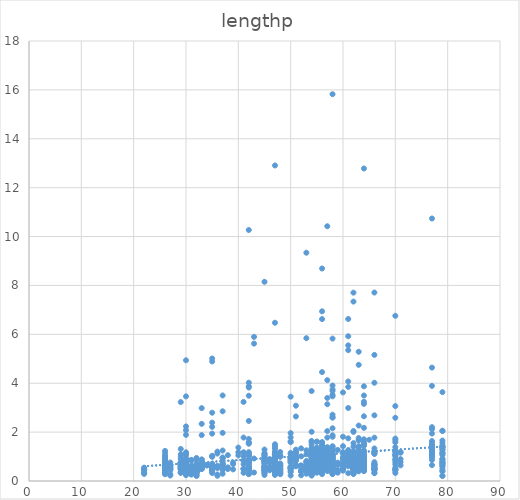
| Category | lengthp |
|---|---|
| 60.0 | 1.183 |
| 61.0 | 1.024 |
| 60.0 | 0.48 |
| 60.0 | 1.812 |
| 60.0 | 1.425 |
| 60.0 | 0.637 |
| 60.0 | 0.803 |
| 60.0 | 0.473 |
| 61.0 | 1.032 |
| 71.0 | 0.774 |
| 71.0 | 0.639 |
| 71.0 | 0.897 |
| 71.0 | 1.156 |
| 61.0 | 1.138 |
| 45.0 | 0.813 |
| 45.0 | 0.565 |
| 45.0 | 0.532 |
| 45.0 | 0.568 |
| 45.0 | 0.455 |
| 45.0 | 0.552 |
| 45.0 | 0.448 |
| 45.0 | 1.057 |
| 45.0 | 0.453 |
| 45.0 | 0.95 |
| 45.0 | 0.381 |
| 45.0 | 0.326 |
| 45.0 | 0.245 |
| 45.0 | 0.481 |
| 45.0 | 0.523 |
| 45.0 | 0.577 |
| 45.0 | 0.403 |
| 61.0 | 0.908 |
| 47.0 | 0.665 |
| 47.0 | 0.381 |
| 47.0 | 0.542 |
| 47.0 | 0.584 |
| 47.0 | 0.626 |
| 47.0 | 0.332 |
| 47.0 | 0.339 |
| 47.0 | 0.497 |
| 47.0 | 0.948 |
| 47.0 | 0.503 |
| 47.0 | 0.261 |
| 47.0 | 0.733 |
| 47.0 | 0.409 |
| 47.0 | 1.32 |
| 47.0 | 0.862 |
| 47.0 | 0.526 |
| 47.0 | 0.636 |
| 47.0 | 0.547 |
| 47.0 | 0.914 |
| 47.0 | 0.251 |
| 47.0 | 0.433 |
| 61.0 | 0.771 |
| 62.0 | 0.573 |
| 62.0 | 0.729 |
| 62.0 | 0.287 |
| 62.0 | 0.538 |
| 62.0 | 0.474 |
| 62.0 | 0.344 |
| 62.0 | 0.733 |
| 62.0 | 0.514 |
| 62.0 | 0.53 |
| 62.0 | 0.579 |
| 62.0 | 0.538 |
| 62.0 | 0.632 |
| 62.0 | 0.514 |
| 62.0 | 0.468 |
| 62.0 | 0.642 |
| 62.0 | 0.478 |
| 62.0 | 0.32 |
| 62.0 | 0.417 |
| 62.0 | 0.81 |
| 62.0 | 0.395 |
| 62.0 | 0.391 |
| 62.0 | 0.302 |
| 62.0 | 2.008 |
| 52.0 | 1.008 |
| 56.0 | 0.534 |
| 56.0 | 0.53 |
| 56.0 | 0.368 |
| 56.0 | 0.449 |
| 56.0 | 0.502 |
| 56.0 | 0.581 |
| 56.0 | 0.411 |
| 56.0 | 0.8 |
| 56.0 | 0.395 |
| 56.0 | 1.432 |
| 56.0 | 1.59 |
| 77.0 | 0.863 |
| 56.0 | 0.442 |
| 56.0 | 0.345 |
| 56.0 | 0.455 |
| 56.0 | 0.619 |
| 56.0 | 0.819 |
| 56.0 | 0.355 |
| 56.0 | 0.532 |
| 56.0 | 0.665 |
| 56.0 | 0.497 |
| 56.0 | 0.632 |
| 56.0 | 0.579 |
| 56.0 | 0.71 |
| 56.0 | 0.444 |
| 56.0 | 0.374 |
| 56.0 | 0.677 |
| 56.0 | 0.464 |
| 56.0 | 0.382 |
| 56.0 | 0.374 |
| 56.0 | 0.481 |
| 56.0 | 0.671 |
| 56.0 | 0.352 |
| 56.0 | 0.416 |
| 56.0 | 0.81 |
| 56.0 | 0.584 |
| 56.0 | 1.074 |
| 56.0 | 0.642 |
| 56.0 | 0.513 |
| 56.0 | 0.465 |
| 56.0 | 0.429 |
| 56.0 | 0.484 |
| 56.0 | 0.558 |
| 56.0 | 0.384 |
| 56.0 | 0.413 |
| 56.0 | 0.329 |
| 56.0 | 0.339 |
| 56.0 | 0.426 |
| 56.0 | 0.323 |
| 56.0 | 0.945 |
| 56.0 | 1.287 |
| 56.0 | 0.918 |
| 77.0 | 1.392 |
| 45.0 | 0.623 |
| 45.0 | 0.872 |
| 77.0 | 1.013 |
| 48.0 | 0.474 |
| 48.0 | 0.324 |
| 48.0 | 0.472 |
| 48.0 | 0.374 |
| 48.0 | 0.319 |
| 48.0 | 0.638 |
| 48.0 | 0.54 |
| 48.0 | 0.637 |
| 48.0 | 0.281 |
| 48.0 | 0.414 |
| 64.0 | 0.405 |
| 64.0 | 0.513 |
| 77.0 | 1.216 |
| 64.0 | 3.243 |
| 64.0 | 0.959 |
| 64.0 | 0.5 |
| 64.0 | 0.821 |
| 64.0 | 0.744 |
| 64.0 | 0.451 |
| 64.0 | 1.579 |
| 64.0 | 0.462 |
| 64.0 | 0.665 |
| 64.0 | 0.806 |
| 64.0 | 0.552 |
| 64.0 | 0.503 |
| 64.0 | 0.519 |
| 64.0 | 0.819 |
| 64.0 | 0.677 |
| 64.0 | 0.668 |
| 64.0 | 0.455 |
| 64.0 | 0.742 |
| 64.0 | 0.819 |
| 64.0 | 0.926 |
| 64.0 | 0.455 |
| 64.0 | 0.667 |
| 64.0 | 0.585 |
| 64.0 | 0.695 |
| 64.0 | 0.738 |
| 64.0 | 0.508 |
| 64.0 | 0.741 |
| 64.0 | 0.603 |
| 64.0 | 0.569 |
| 64.0 | 0.418 |
| 64.0 | 1.024 |
| 64.0 | 1.251 |
| 64.0 | 1.029 |
| 64.0 | 1.449 |
| 64.0 | 3.498 |
| 64.0 | 2.174 |
| 64.0 | 3.154 |
| 64.0 | 3.874 |
| 70.0 | 1.093 |
| 77.0 | 1.571 |
| 70.0 | 1.384 |
| 70.0 | 1.219 |
| 70.0 | 0.439 |
| 70.0 | 0.775 |
| 70.0 | 0.879 |
| 70.0 | 1.065 |
| 70.0 | 1.583 |
| 70.0 | 0.679 |
| 70.0 | 0.473 |
| 70.0 | 0.494 |
| 70.0 | 0.538 |
| 70.0 | 1.008 |
| 70.0 | 1.737 |
| 70.0 | 1.063 |
| 70.0 | 1.19 |
| 70.0 | 6.758 |
| 70.0 | 3.065 |
| 70.0 | 2.587 |
| 70.0 | 1.672 |
| 70.0 | 0.439 |
| 70.0 | 0.328 |
| 70.0 | 0.876 |
| 77.0 | 1.142 |
| 65.0 | 1.687 |
| 77.0 | 1.275 |
| 66.0 | 1.111 |
| 77.0 | 1.089 |
| 58.0 | 0.281 |
| 58.0 | 1.81 |
| 58.0 | 0.739 |
| 58.0 | 0.623 |
| 58.0 | 0.535 |
| 58.0 | 0.687 |
| 58.0 | 0.539 |
| 58.0 | 0.687 |
| 58.0 | 0.655 |
| 58.0 | 0.929 |
| 58.0 | 0.703 |
| 58.0 | 0.629 |
| 58.0 | 0.755 |
| 58.0 | 0.352 |
| 58.0 | 0.871 |
| 58.0 | 0.735 |
| 58.0 | 0.516 |
| 58.0 | 0.383 |
| 58.0 | 0.455 |
| 58.0 | 0.575 |
| 58.0 | 0.516 |
| 58.0 | 0.713 |
| 58.0 | 0.642 |
| 58.0 | 0.755 |
| 58.0 | 1.079 |
| 55.0 | 0.59 |
| 77.0 | 2.203 |
| 55.0 | 0.771 |
| 55.0 | 0.478 |
| 55.0 | 0.761 |
| 55.0 | 0.383 |
| 55.0 | 0.911 |
| 55.0 | 0.793 |
| 55.0 | 0.723 |
| 55.0 | 0.735 |
| 77.0 | 2.124 |
| 54.0 | 0.482 |
| 54.0 | 0.498 |
| 54.0 | 0.611 |
| 54.0 | 0.393 |
| 54.0 | 0.538 |
| 77.0 | 1.941 |
| 54.0 | 0.522 |
| 54.0 | 0.349 |
| 54.0 | 0.34 |
| 54.0 | 0.591 |
| 54.0 | 0.642 |
| 54.0 | 0.481 |
| 54.0 | 0.464 |
| 54.0 | 0.34 |
| 54.0 | 0.37 |
| 54.0 | 0.445 |
| 54.0 | 0.403 |
| 54.0 | 0.546 |
| 54.0 | 0.79 |
| 54.0 | 0.36 |
| 54.0 | 1.069 |
| 54.0 | 1.294 |
| 54.0 | 0.528 |
| 54.0 | 0.53 |
| 54.0 | 0.5 |
| 54.0 | 0.436 |
| 54.0 | 0.285 |
| 54.0 | 0.308 |
| 54.0 | 0.276 |
| 54.0 | 0.433 |
| 54.0 | 0.322 |
| 54.0 | 0.388 |
| 54.0 | 0.525 |
| 54.0 | 0.222 |
| 54.0 | 0.801 |
| 54.0 | 0.272 |
| 54.0 | 0.442 |
| 54.0 | 0.386 |
| 54.0 | 0.527 |
| 54.0 | 0.415 |
| 54.0 | 0.536 |
| 54.0 | 0.468 |
| 54.0 | 0.462 |
| 54.0 | 0.391 |
| 54.0 | 0.719 |
| 54.0 | 0.372 |
| 54.0 | 0.451 |
| 54.0 | 0.429 |
| 66.0 | 1.184 |
| 66.0 | 1.165 |
| 66.0 | 1.116 |
| 66.0 | 1.773 |
| 66.0 | 0.538 |
| 66.0 | 1.217 |
| 66.0 | 0.666 |
| 66.0 | 0.611 |
| 66.0 | 0.32 |
| 66.0 | 0.771 |
| 66.0 | 0.528 |
| 66.0 | 0.468 |
| 66.0 | 0.534 |
| 66.0 | 0.503 |
| 66.0 | 0.432 |
| 66.0 | 0.7 |
| 66.0 | 0.674 |
| 66.0 | 1.332 |
| 66.0 | 0.639 |
| 66.0 | 0.329 |
| 66.0 | 0.445 |
| 66.0 | 0.568 |
| 66.0 | 0.5 |
| 66.0 | 0.694 |
| 66.0 | 2.686 |
| 66.0 | 4.019 |
| 66.0 | 5.158 |
| 66.0 | 7.71 |
| 50.0 | 0.368 |
| 50.0 | 0.562 |
| 50.0 | 0.227 |
| 79.0 | 2.045 |
| 79.0 | 1.41 |
| 79.0 | 1.381 |
| 79.0 | 0.39 |
| 79.0 | 0.503 |
| 79.0 | 0.413 |
| 79.0 | 0.906 |
| 79.0 | 1.655 |
| 79.0 | 0.613 |
| 79.0 | 1.284 |
| 79.0 | 1.119 |
| 79.0 | 1.377 |
| 79.0 | 1.453 |
| 79.0 | 0.7 |
| 79.0 | 0.717 |
| 79.0 | 0.777 |
| 79.0 | 0.773 |
| 79.0 | 0.684 |
| 79.0 | 1.559 |
| 79.0 | 1.148 |
| 79.0 | 1.168 |
| 79.0 | 1.397 |
| 79.0 | 1.287 |
| 79.0 | 1.065 |
| 79.0 | 2.058 |
| 79.0 | 0.606 |
| 79.0 | 0.832 |
| 79.0 | 0.89 |
| 79.0 | 3.635 |
| 79.0 | 0.206 |
| 79.0 | 0.216 |
| 58.0 | 0.32 |
| 58.0 | 0.688 |
| 58.0 | 0.482 |
| 58.0 | 1.073 |
| 58.0 | 3.749 |
| 58.0 | 0.695 |
| 58.0 | 0.879 |
| 58.0 | 0.485 |
| 58.0 | 0.556 |
| 58.0 | 1 |
| 58.0 | 0.518 |
| 58.0 | 0.305 |
| 58.0 | 0.479 |
| 58.0 | 3.906 |
| 58.0 | 5.826 |
| 58.0 | 3.465 |
| 58.0 | 0.91 |
| 58.0 | 1.397 |
| 58.0 | 0.635 |
| 58.0 | 0.635 |
| 58.0 | 0.771 |
| 58.0 | 1.423 |
| 58.0 | 0.835 |
| 51.0 | 1.045 |
| 51.0 | 1.012 |
| 51.0 | 0.895 |
| 51.0 | 0.858 |
| 51.0 | 0.923 |
| 51.0 | 0.879 |
| 51.0 | 0.862 |
| 51.0 | 1.144 |
| 51.0 | 1.219 |
| 51.0 | 0.923 |
| 51.0 | 1.283 |
| 51.0 | 0.862 |
| 51.0 | 1.144 |
| 51.0 | 0.674 |
| 51.0 | 0.905 |
| 51.0 | 0.844 |
| 51.0 | 0.617 |
| 51.0 | 0.603 |
| 51.0 | 1.16 |
| 51.0 | 3.081 |
| 51.0 | 2.64 |
| 48.0 | 1.052 |
| 48.0 | 0.568 |
| 48.0 | 0.987 |
| 48.0 | 0.6 |
| 48.0 | 0.29 |
| 48.0 | 0.452 |
| 48.0 | 0.468 |
| 48.0 | 0.613 |
| 48.0 | 0.719 |
| 48.0 | 0.371 |
| 48.0 | 1.187 |
| 48.0 | 0.513 |
| 48.0 | 0.694 |
| 48.0 | 0.681 |
| 48.0 | 1.032 |
| 56.0 | 0.555 |
| 56.0 | 1.09 |
| 56.0 | 0.761 |
| 56.0 | 0.464 |
| 56.0 | 0.399 |
| 56.0 | 0.737 |
| 56.0 | 0.433 |
| 56.0 | 0.615 |
| 56.0 | 0.834 |
| 56.0 | 0.484 |
| 56.0 | 0.362 |
| 56.0 | 0.751 |
| 56.0 | 0.425 |
| 56.0 | 0.374 |
| 56.0 | 0.634 |
| 56.0 | 0.897 |
| 56.0 | 0.442 |
| 56.0 | 0.655 |
| 56.0 | 0.645 |
| 56.0 | 0.723 |
| 56.0 | 0.552 |
| 56.0 | 0.552 |
| 56.0 | 0.803 |
| 56.0 | 0.623 |
| 56.0 | 0.281 |
| 56.0 | 0.587 |
| 56.0 | 0.819 |
| 56.0 | 0.423 |
| 56.0 | 0.526 |
| 56.0 | 1.471 |
| 56.0 | 0.874 |
| 56.0 | 0.433 |
| 56.0 | 0.456 |
| 56.0 | 0.61 |
| 56.0 | 0.495 |
| 56.0 | 0.441 |
| 56.0 | 1.162 |
| 56.0 | 0.668 |
| 56.0 | 0.939 |
| 56.0 | 0.866 |
| 56.0 | 1.304 |
| 56.0 | 1.579 |
| 56.0 | 0.704 |
| 56.0 | 0.642 |
| 56.0 | 0.767 |
| 56.0 | 0.656 |
| 56.0 | 0.504 |
| 56.0 | 0.54 |
| 56.0 | 0.542 |
| 56.0 | 1.113 |
| 56.0 | 1.251 |
| 56.0 | 0.749 |
| 56.0 | 0.964 |
| 56.0 | 1.47 |
| 56.0 | 6.623 |
| 56.0 | 4.455 |
| 63.0 | 1.296 |
| 63.0 | 0.765 |
| 63.0 | 0.551 |
| 63.0 | 0.85 |
| 63.0 | 0.429 |
| 63.0 | 0.761 |
| 63.0 | 0.583 |
| 63.0 | 0.478 |
| 63.0 | 0.749 |
| 63.0 | 0.457 |
| 63.0 | 0.644 |
| 63.0 | 0.397 |
| 63.0 | 0.619 |
| 63.0 | 0.7 |
| 63.0 | 0.563 |
| 63.0 | 1.684 |
| 63.0 | 4.753 |
| 63.0 | 1.417 |
| 54.0 | 0.81 |
| 54.0 | 0.374 |
| 54.0 | 0.632 |
| 54.0 | 0.352 |
| 54.0 | 0.752 |
| 54.0 | 0.387 |
| 54.0 | 0.981 |
| 54.0 | 0.542 |
| 54.0 | 0.458 |
| 54.0 | 0.465 |
| 54.0 | 0.535 |
| 54.0 | 0.561 |
| 54.0 | 1.5 |
| 54.0 | 0.79 |
| 54.0 | 0.452 |
| 54.0 | 1.229 |
| 54.0 | 0.995 |
| 54.0 | 0.703 |
| 54.0 | 0.954 |
| 54.0 | 0.628 |
| 54.0 | 0.728 |
| 54.0 | 0.462 |
| 54.0 | 0.531 |
| 54.0 | 0.397 |
| 54.0 | 0.264 |
| 54.0 | 0.923 |
| 54.0 | 0.408 |
| 54.0 | 0.385 |
| 54.0 | 0.495 |
| 54.0 | 1.048 |
| 54.0 | 1.003 |
| 54.0 | 1.171 |
| 54.0 | 0.252 |
| 71.0 | 1.194 |
| 54.0 | 0.544 |
| 60.0 | 0.53 |
| 60.0 | 0.988 |
| 60.0 | 0.607 |
| 60.0 | 0.567 |
| 60.0 | 0.899 |
| 60.0 | 0.619 |
| 60.0 | 0.907 |
| 60.0 | 0.623 |
| 60.0 | 0.628 |
| 60.0 | 0.425 |
| 60.0 | 0.534 |
| 60.0 | 0.644 |
| 60.0 | 0.474 |
| 60.0 | 0.559 |
| 60.0 | 0.555 |
| 60.0 | 1.142 |
| 60.0 | 0.514 |
| 60.0 | 0.563 |
| 60.0 | 0.563 |
| 60.0 | 0.717 |
| 60.0 | 0.595 |
| 60.0 | 0.587 |
| 60.0 | 3.623 |
| 46.0 | 0.763 |
| 46.0 | 0.439 |
| 46.0 | 0.526 |
| 46.0 | 0.897 |
| 46.0 | 0.597 |
| 46.0 | 0.522 |
| 46.0 | 0.472 |
| 46.0 | 0.557 |
| 46.0 | 0.779 |
| 53.0 | 1.095 |
| 53.0 | 0.779 |
| 53.0 | 0.444 |
| 53.0 | 0.641 |
| 53.0 | 0.708 |
| 53.0 | 0.662 |
| 53.0 | 0.779 |
| 53.0 | 0.428 |
| 34.0 | 0.65 |
| 34.0 | 0.634 |
| 34.0 | 0.654 |
| 32.0 | 0.638 |
| 32.0 | 0.607 |
| 32.0 | 0.553 |
| 32.0 | 0.597 |
| 32.0 | 0.498 |
| 32.0 | 0.484 |
| 32.0 | 0.275 |
| 42.0 | 0.845 |
| 42.0 | 1.036 |
| 42.0 | 0.565 |
| 42.0 | 1.719 |
| 42.0 | 1.11 |
| 42.0 | 0.568 |
| 42.0 | 0.281 |
| 42.0 | 3.487 |
| 42.0 | 2.456 |
| 42.0 | 4.023 |
| 37.0 | 2.852 |
| 37.0 | 3.5 |
| 37.0 | 0.737 |
| 36.0 | 0.268 |
| 36.0 | 0.214 |
| 36.0 | 0.595 |
| 36.0 | 0.528 |
| 36.0 | 0.615 |
| 36.0 | 1.123 |
| 36.0 | 1.203 |
| 32.0 | 0.405 |
| 32.0 | 0.374 |
| 32.0 | 0.872 |
| 32.0 | 0.715 |
| 32.0 | 0.574 |
| 32.0 | 0.229 |
| 32.0 | 0.526 |
| 32.0 | 0.44 |
| 32.0 | 0.392 |
| 32.0 | 0.459 |
| 32.0 | 0.415 |
| 26.0 | 1.013 |
| 26.0 | 1.231 |
| 26.0 | 0.331 |
| 26.0 | 0.497 |
| 26.0 | 0.872 |
| 26.0 | 0.462 |
| 26.0 | 0.615 |
| 26.0 | 0.933 |
| 26.0 | 0.482 |
| 26.0 | 0.569 |
| 26.0 | 0.646 |
| 26.0 | 0.731 |
| 26.0 | 0.679 |
| 26.0 | 0.623 |
| 26.0 | 0.405 |
| 26.0 | 0.641 |
| 26.0 | 0.454 |
| 26.0 | 0.444 |
| 26.0 | 0.628 |
| 26.0 | 0.372 |
| 26.0 | 0.297 |
| 26.0 | 0.751 |
| 26.0 | 0.277 |
| 26.0 | 0.541 |
| 26.0 | 0.5 |
| 26.0 | 0.49 |
| 26.0 | 0.508 |
| 26.0 | 0.382 |
| 26.0 | 0.769 |
| 26.0 | 0.567 |
| 26.0 | 1.026 |
| 26.0 | 0.838 |
| 26.0 | 0.577 |
| 26.0 | 0.674 |
| 26.0 | 1.131 |
| 27.0 | 0.532 |
| 27.0 | 0.224 |
| 27.0 | 0.656 |
| 27.0 | 0.445 |
| 27.0 | 0.508 |
| 27.0 | 0.755 |
| 27.0 | 0.565 |
| 27.0 | 0.476 |
| 27.0 | 0.64 |
| 27.0 | 0.593 |
| 27.0 | 0.284 |
| 35.0 | 0.556 |
| 35.0 | 0.703 |
| 35.0 | 1.03 |
| 35.0 | 0.642 |
| 35.0 | 0.64 |
| 35.0 | 0.536 |
| 35.0 | 0.646 |
| 35.0 | 1.938 |
| 30.0 | 0.52 |
| 30.0 | 0.49 |
| 30.0 | 0.687 |
| 30.0 | 0.479 |
| 30.0 | 0.374 |
| 30.0 | 0.431 |
| 30.0 | 0.346 |
| 30.0 | 0.5 |
| 30.0 | 0.428 |
| 30.0 | 0.485 |
| 30.0 | 0.413 |
| 30.0 | 0.523 |
| 30.0 | 0.379 |
| 30.0 | 0.662 |
| 30.0 | 0.59 |
| 30.0 | 0.372 |
| 30.0 | 0.446 |
| 30.0 | 0.477 |
| 30.0 | 0.4 |
| 30.0 | 0.377 |
| 30.0 | 0.623 |
| 30.0 | 0.519 |
| 30.0 | 0.765 |
| 30.0 | 0.413 |
| 30.0 | 0.552 |
| 30.0 | 4.939 |
| 37.0 | 0.929 |
| 37.0 | 0.962 |
| 37.0 | 0.521 |
| 37.0 | 0.297 |
| 37.0 | 0.526 |
| 37.0 | 0.7 |
| 37.0 | 0.449 |
| 37.0 | 1.247 |
| 37.0 | 0.929 |
| 37.0 | 0.649 |
| 37.0 | 0.632 |
| 37.0 | 1.969 |
| 37.0 | 0.682 |
| 22.0 | 0.46 |
| 22.0 | 0.472 |
| 22.0 | 0.423 |
| 22.0 | 0.494 |
| 22.0 | 0.475 |
| 22.0 | 0.546 |
| 22.0 | 0.313 |
| 22.0 | 0.347 |
| 22.0 | 0.507 |
| 22.0 | 0.29 |
| 30.0 | 0.363 |
| 30.0 | 0.28 |
| 30.0 | 0.313 |
| 30.0 | 0.906 |
| 30.0 | 0.532 |
| 30.0 | 0.759 |
| 30.0 | 1.054 |
| 30.0 | 0.567 |
| 30.0 | 0.633 |
| 30.0 | 1.126 |
| 30.0 | 0.7 |
| 30.0 | 0.474 |
| 30.0 | 0.64 |
| 30.0 | 0.64 |
| 30.0 | 0.802 |
| 30.0 | 0.502 |
| 30.0 | 3.462 |
| 38.0 | 1.058 |
| 38.0 | 0.49 |
| 38.0 | 0.558 |
| 32.0 | 0.206 |
| 32.0 | 0.521 |
| 32.0 | 0.431 |
| 32.0 | 0.459 |
| 32.0 | 0.605 |
| 32.0 | 0.51 |
| 32.0 | 0.527 |
| 30.0 | 0.24 |
| 30.0 | 0.332 |
| 30.0 | 0.354 |
| 30.0 | 0.8 |
| 30.0 | 0.489 |
| 30.0 | 0.4 |
| 30.0 | 0.598 |
| 30.0 | 0.442 |
| 30.0 | 0.606 |
| 30.0 | 0.734 |
| 30.0 | 0.49 |
| 30.0 | 0.557 |
| 30.0 | 0.555 |
| 30.0 | 0.678 |
| 30.0 | 0.425 |
| 30.0 | 0.492 |
| 30.0 | 0.534 |
| 30.0 | 0.903 |
| 30.0 | 0.828 |
| 30.0 | 0.6 |
| 30.0 | 0.674 |
| 30.0 | 0.652 |
| 30.0 | 0.568 |
| 30.0 | 0.545 |
| 30.0 | 0.513 |
| 30.0 | 0.755 |
| 30.0 | 0.61 |
| 30.0 | 0.574 |
| 30.0 | 0.69 |
| 30.0 | 0.515 |
| 30.0 | 0.713 |
| 30.0 | 0.69 |
| 30.0 | 0.651 |
| 30.0 | 0.792 |
| 30.0 | 0.487 |
| 30.0 | 0.548 |
| 30.0 | 0.539 |
| 30.0 | 0.49 |
| 30.0 | 0.677 |
| 30.0 | 0.832 |
| 30.0 | 0.626 |
| 30.0 | 0.723 |
| 30.0 | 0.538 |
| 30.0 | 0.687 |
| 30.0 | 0.41 |
| 30.0 | 0.556 |
| 30.0 | 2.082 |
| 30.0 | 1.887 |
| 30.0 | 2.232 |
| 29.0 | 0.381 |
| 29.0 | 0.688 |
| 29.0 | 0.751 |
| 29.0 | 0.765 |
| 29.0 | 0.709 |
| 29.0 | 0.648 |
| 29.0 | 0.646 |
| 29.0 | 0.737 |
| 29.0 | 3.229 |
| 29.0 | 0.569 |
| 35.0 | 4.891 |
| 35.0 | 5.012 |
| 35.0 | 2.215 |
| 35.0 | 2.794 |
| 35.0 | 2.389 |
| 35.0 | 0.449 |
| 35.0 | 0.99 |
| 35.0 | 0.426 |
| 39.0 | 0.755 |
| 39.0 | 0.694 |
| 39.0 | 0.474 |
| 35.0 | 0.588 |
| 35.0 | 0.324 |
| 35.0 | 0.525 |
| 35.0 | 0.387 |
| 35.0 | 0.567 |
| 32.0 | 0.387 |
| 32.0 | 0.35 |
| 32.0 | 0.377 |
| 32.0 | 0.318 |
| 32.0 | 0.632 |
| 29.0 | 1.093 |
| 29.0 | 0.51 |
| 29.0 | 0.47 |
| 29.0 | 0.51 |
| 29.0 | 0.583 |
| 29.0 | 0.538 |
| 29.0 | 0.607 |
| 29.0 | 0.733 |
| 29.0 | 0.648 |
| 29.0 | 0.547 |
| 29.0 | 0.482 |
| 32.0 | 0.503 |
| 32.0 | 0.485 |
| 32.0 | 0.4 |
| 32.0 | 0.451 |
| 32.0 | 0.944 |
| 32.0 | 0.613 |
| 32.0 | 0.508 |
| 32.0 | 0.597 |
| 32.0 | 0.618 |
| 32.0 | 0.636 |
| 32.0 | 0.492 |
| 32.0 | 0.467 |
| 32.0 | 0.528 |
| 32.0 | 0.515 |
| 32.0 | 0.441 |
| 32.0 | 0.349 |
| 32.0 | 0.572 |
| 32.0 | 0.585 |
| 32.0 | 0.455 |
| 32.0 | 0.385 |
| 32.0 | 0.439 |
| 32.0 | 0.37 |
| 31.0 | 0.844 |
| 31.0 | 0.306 |
| 31.0 | 0.862 |
| 31.0 | 0.372 |
| 31.0 | 0.383 |
| 31.0 | 0.553 |
| 31.0 | 0.261 |
| 31.0 | 0.33 |
| 31.0 | 0.389 |
| 31.0 | 0.482 |
| 31.0 | 0.468 |
| 31.0 | 0.565 |
| 31.0 | 0.52 |
| 31.0 | 0.626 |
| 35.0 | 0.451 |
| 35.0 | 0.634 |
| 35.0 | 0.698 |
| 35.0 | 0.547 |
| 35.0 | 1.01 |
| 35.0 | 0.462 |
| 42.0 | 0.529 |
| 42.0 | 0.765 |
| 42.0 | 3.824 |
| 42.0 | 3.876 |
| 42.0 | 10.268 |
| 29.0 | 0.336 |
| 29.0 | 0.342 |
| 33.0 | 0.587 |
| 33.0 | 2.981 |
| 33.0 | 1.877 |
| 33.0 | 0.728 |
| 33.0 | 0.692 |
| 33.0 | 0.705 |
| 33.0 | 0.879 |
| 30.0 | 0.318 |
| 30.0 | 0.413 |
| 30.0 | 0.921 |
| 30.0 | 0.697 |
| 30.0 | 0.554 |
| 30.0 | 1.174 |
| 29.0 | 0.636 |
| 29.0 | 0.736 |
| 29.0 | 0.728 |
| 29.0 | 1.31 |
| 29.0 | 0.721 |
| 29.0 | 0.99 |
| 29.0 | 0.89 |
| 29.0 | 0.692 |
| 33.0 | 0.65 |
| 33.0 | 0.53 |
| 33.0 | 0.678 |
| 33.0 | 0.492 |
| 33.0 | 0.696 |
| 33.0 | 0.665 |
| 33.0 | 0.673 |
| 33.0 | 0.522 |
| 33.0 | 0.639 |
| 33.0 | 0.87 |
| 33.0 | 0.493 |
| 33.0 | 0.772 |
| 33.0 | 2.338 |
| 33.0 | 0.777 |
| 41.0 | 0.486 |
| 41.0 | 0.335 |
| 41.0 | 1.171 |
| 41.0 | 1.013 |
| 41.0 | 0.69 |
| 41.0 | 0.492 |
| 41.0 | 0.51 |
| 41.0 | 1.165 |
| 41.0 | 0.842 |
| 41.0 | 0.835 |
| 41.0 | 1.777 |
| 41.0 | 3.235 |
| 43.0 | 0.919 |
| 43.0 | 5.895 |
| 43.0 | 5.621 |
| 43.0 | 0.346 |
| 42.0 | 0.755 |
| 42.0 | 0.287 |
| 42.0 | 0.558 |
| 42.0 | 0.497 |
| 42.0 | 0.477 |
| 42.0 | 0.671 |
| 42.0 | 0.419 |
| 42.0 | 0.455 |
| 42.0 | 0.765 |
| 42.0 | 1.562 |
| 42.0 | 0.797 |
| 42.0 | 0.719 |
| 42.0 | 1.588 |
| 42.0 | 0.83 |
| 42.0 | 0.588 |
| 42.0 | 0.868 |
| 42.0 | 1.181 |
| 42.0 | 1.144 |
| 42.0 | 0.83 |
| 42.0 | 1.523 |
| 42.0 | 1.033 |
| 42.0 | 0.882 |
| 42.0 | 0.784 |
| 50.0 | 1.784 |
| 50.0 | 0.542 |
| 50.0 | 0.523 |
| 50.0 | 0.752 |
| 50.0 | 0.797 |
| 50.0 | 0.484 |
| 50.0 | 0.516 |
| 50.0 | 0.503 |
| 50.0 | 1.588 |
| 50.0 | 0.399 |
| 50.0 | 0.85 |
| 50.0 | 1.961 |
| 50.0 | 1.621 |
| 58.0 | 1.02 |
| 58.0 | 1.046 |
| 58.0 | 1 |
| 58.0 | 1.118 |
| 58.0 | 1.105 |
| 58.0 | 1.229 |
| 58.0 | 0.895 |
| 58.0 | 1.869 |
| 58.0 | 0.837 |
| 64.0 | 0.706 |
| 64.0 | 1.196 |
| 64.0 | 0.752 |
| 64.0 | 0.595 |
| 64.0 | 0.706 |
| 64.0 | 0.876 |
| 64.0 | 0.791 |
| 64.0 | 0.569 |
| 64.0 | 0.712 |
| 64.0 | 1.542 |
| 64.0 | 0.555 |
| 64.0 | 0.644 |
| 64.0 | 0.514 |
| 64.0 | 0.563 |
| 64.0 | 0.591 |
| 64.0 | 0.922 |
| 64.0 | 1.078 |
| 64.0 | 1.464 |
| 64.0 | 0.889 |
| 64.0 | 0.961 |
| 64.0 | 0.791 |
| 64.0 | 0.85 |
| 64.0 | 0.745 |
| 64.0 | 0.83 |
| 64.0 | 0.843 |
| 64.0 | 0.634 |
| 64.0 | 0.667 |
| 64.0 | 1.706 |
| 64.0 | 2.647 |
| 64.0 | 1.516 |
| 64.0 | 1.111 |
| 64.0 | 12.784 |
| 62.0 | 0.83 |
| 62.0 | 0.98 |
| 62.0 | 0.961 |
| 62.0 | 1.144 |
| 62.0 | 0.791 |
| 62.0 | 0.908 |
| 62.0 | 2.046 |
| 62.0 | 0.81 |
| 62.0 | 0.856 |
| 62.0 | 1.203 |
| 62.0 | 1.405 |
| 62.0 | 7.706 |
| 62.0 | 7.34 |
| 63.0 | 0.739 |
| 63.0 | 2.268 |
| 63.0 | 1.758 |
| 63.0 | 1.118 |
| 63.0 | 1.412 |
| 63.0 | 1.392 |
| 63.0 | 0.81 |
| 63.0 | 0.621 |
| 63.0 | 0.575 |
| 63.0 | 0.739 |
| 63.0 | 1.66 |
| 63.0 | 1.203 |
| 63.0 | 0.81 |
| 63.0 | 5.288 |
| 50.0 | 0.935 |
| 50.0 | 0.889 |
| 50.0 | 1.098 |
| 50.0 | 0.948 |
| 50.0 | 0.993 |
| 50.0 | 0.85 |
| 50.0 | 0.765 |
| 50.0 | 0.595 |
| 50.0 | 0.974 |
| 50.0 | 1.15 |
| 50.0 | 3.451 |
| 62.0 | 1.549 |
| 62.0 | 1.216 |
| 62.0 | 0.928 |
| 62.0 | 0.967 |
| 62.0 | 1.196 |
| 62.0 | 0.915 |
| 62.0 | 1.137 |
| 62.0 | 1 |
| 62.0 | 0.967 |
| 63.0 | 0.595 |
| 63.0 | 0.623 |
| 63.0 | 0.879 |
| 63.0 | 0.514 |
| 63.0 | 0.846 |
| 63.0 | 0.522 |
| 63.0 | 0.543 |
| 63.0 | 0.68 |
| 63.0 | 0.668 |
| 63.0 | 0.7 |
| 63.0 | 0.761 |
| 63.0 | 0.518 |
| 63.0 | 0.777 |
| 63.0 | 0.774 |
| 63.0 | 0.742 |
| 63.0 | 0.632 |
| 63.0 | 0.839 |
| 63.0 | 1.026 |
| 63.0 | 0.942 |
| 63.0 | 0.819 |
| 55.0 | 1.328 |
| 55.0 | 0.826 |
| 55.0 | 0.976 |
| 55.0 | 0.652 |
| 55.0 | 0.551 |
| 55.0 | 0.34 |
| 55.0 | 1.032 |
| 55.0 | 1.032 |
| 55.0 | 1.04 |
| 55.0 | 0.887 |
| 54.0 | 0.765 |
| 54.0 | 1.353 |
| 54.0 | 1.137 |
| 54.0 | 1.601 |
| 54.0 | 1.641 |
| 54.0 | 1.216 |
| 54.0 | 0.869 |
| 54.0 | 1.046 |
| 54.0 | 0.81 |
| 54.0 | 2.013 |
| 54.0 | 1.157 |
| 54.0 | 1.17 |
| 54.0 | 3.68 |
| 57.0 | 0.559 |
| 57.0 | 1.372 |
| 57.0 | 1.065 |
| 57.0 | 0.737 |
| 57.0 | 0.915 |
| 57.0 | 0.83 |
| 57.0 | 0.976 |
| 57.0 | 1.053 |
| 57.0 | 1.247 |
| 57.0 | 1.377 |
| 57.0 | 1.057 |
| 57.0 | 0.887 |
| 57.0 | 0.931 |
| 57.0 | 0.49 |
| 57.0 | 10.421 |
| 57.0 | 4.126 |
| 57.0 | 2.04 |
| 47.0 | 1.085 |
| 47.0 | 1.137 |
| 47.0 | 1.183 |
| 47.0 | 1.503 |
| 47.0 | 1.379 |
| 47.0 | 1.19 |
| 47.0 | 0.784 |
| 47.0 | 12.908 |
| 58.0 | 0.569 |
| 58.0 | 2.595 |
| 58.0 | 1.216 |
| 58.0 | 1.163 |
| 58.0 | 1.32 |
| 58.0 | 2.157 |
| 58.0 | 0.98 |
| 58.0 | 3.686 |
| 58.0 | 2.712 |
| 58.0 | 15.824 |
| 55.0 | 1.15 |
| 55.0 | 0.794 |
| 55.0 | 1.271 |
| 55.0 | 1.15 |
| 55.0 | 1.607 |
| 55.0 | 1.206 |
| 55.0 | 0.927 |
| 55.0 | 0.895 |
| 55.0 | 1.15 |
| 55.0 | 0.794 |
| 55.0 | 1.271 |
| 55.0 | 1.15 |
| 55.0 | 1.607 |
| 55.0 | 1.206 |
| 55.0 | 0.927 |
| 55.0 | 0.895 |
| 55.0 | 1.368 |
| 55.0 | 0.858 |
| 55.0 | 1.053 |
| 55.0 | 0.417 |
| 55.0 | 0.745 |
| 55.0 | 0.636 |
| 55.0 | 0.761 |
| 55.0 | 1.036 |
| 58.0 | 1.1 |
| 58.0 | 0.894 |
| 58.0 | 0.513 |
| 58.0 | 3.526 |
| 58.0 | 2.603 |
| 58.0 | 0.697 |
| 47.0 | 0.834 |
| 47.0 | 0.741 |
| 47.0 | 1.093 |
| 47.0 | 0.644 |
| 47.0 | 1.457 |
| 47.0 | 1.081 |
| 47.0 | 1.016 |
| 47.0 | 0.785 |
| 47.0 | 0.895 |
| 47.0 | 6.474 |
| 42.0 | 0.887 |
| 42.0 | 1.042 |
| 42.0 | 0.59 |
| 40.0 | 1.368 |
| 40.0 | 1.049 |
| 40.0 | 1.178 |
| 53.0 | 0.613 |
| 53.0 | 0.297 |
| 53.0 | 0.455 |
| 53.0 | 1.255 |
| 53.0 | 0.819 |
| 53.0 | 0.519 |
| 53.0 | 0.587 |
| 53.0 | 5.843 |
| 53.0 | 9.339 |
| 59.0 | 0.341 |
| 59.0 | 0.454 |
| 59.0 | 0.664 |
| 59.0 | 1.272 |
| 59.0 | 0.751 |
| 77.0 | 0.652 |
| 77.0 | 1.328 |
| 77.0 | 4.641 |
| 77.0 | 1.477 |
| 77.0 | 0.967 |
| 77.0 | 1.229 |
| 77.0 | 1.186 |
| 77.0 | 1.093 |
| 77.0 | 1.368 |
| 77.0 | 1.352 |
| 77.0 | 1.247 |
| 77.0 | 1.634 |
| 77.0 | 1.301 |
| 77.0 | 1.438 |
| 77.0 | 1.444 |
| 77.0 | 1.229 |
| 77.0 | 10.739 |
| 77.0 | 3.891 |
| 61.0 | 1.206 |
| 61.0 | 0.83 |
| 61.0 | 1.045 |
| 61.0 | 0.972 |
| 61.0 | 1.267 |
| 61.0 | 0.773 |
| 61.0 | 1.049 |
| 61.0 | 0.66 |
| 61.0 | 0.603 |
| 61.0 | 1.077 |
| 61.0 | 0.32 |
| 61.0 | 0.725 |
| 57.0 | 1.777 |
| 57.0 | 1.158 |
| 57.0 | 1.126 |
| 57.0 | 1.012 |
| 57.0 | 1.089 |
| 57.0 | 0.688 |
| 57.0 | 3.397 |
| 61.0 | 0.719 |
| 61.0 | 0.719 |
| 61.0 | 5.922 |
| 61.0 | 4.072 |
| 61.0 | 2.987 |
| 61.0 | 5.549 |
| 61.0 | 5.353 |
| 61.0 | 3.85 |
| 61.0 | 1.745 |
| 45.0 | 0.696 |
| 45.0 | 0.951 |
| 45.0 | 0.316 |
| 45.0 | 0.858 |
| 45.0 | 0.405 |
| 45.0 | 0.595 |
| 45.0 | 0.83 |
| 45.0 | 0.814 |
| 45.0 | 8.15 |
| 61.0 | 6.628 |
| 56.0 | 1.248 |
| 56.0 | 1.268 |
| 56.0 | 1.007 |
| 47.0 | 0.676 |
| 47.0 | 0.996 |
| 47.0 | 0.623 |
| 47.0 | 0.502 |
| 56.0 | 1.039 |
| 56.0 | 0.974 |
| 56.0 | 0.83 |
| 56.0 | 1.137 |
| 47.0 | 1.04 |
| 47.0 | 1.069 |
| 47.0 | 0.575 |
| 47.0 | 1.126 |
| 56.0 | 8.693 |
| 56.0 | 6.941 |
| 52.0 | 0.383 |
| 52.0 | 0.439 |
| 52.0 | 0.401 |
| 52.0 | 0.235 |
| 52.0 | 0.548 |
| 52.0 | 0.635 |
| 52.0 | 0.4 |
| 52.0 | 0.626 |
| 52.0 | 0.394 |
| 52.0 | 0.61 |
| 52.0 | 1.335 |
| 52.0 | 0.429 |
| 45.0 | 0.568 |
| 45.0 | 1.139 |
| 45.0 | 1.055 |
| 45.0 | 0.832 |
| 45.0 | 0.761 |
| 45.0 | 0.794 |
| 45.0 | 1.287 |
| 45.0 | 0.806 |
| 45.0 | 0.719 |
| 45.0 | 0.971 |
| 45.0 | 0.458 |
| 45.0 | 1.113 |
| 57.0 | 0.595 |
| 57.0 | 0.405 |
| 57.0 | 1.126 |
| 57.0 | 1.206 |
| 57.0 | 3.142 |